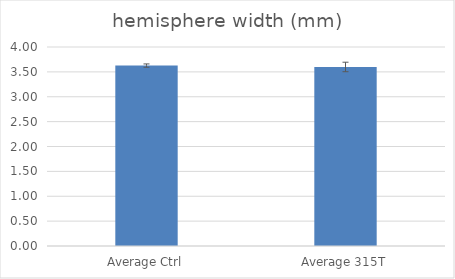
| Category | hemisphere width (mm) |
|---|---|
| Average Ctrl | 3.626 |
| Average 315T | 3.599 |